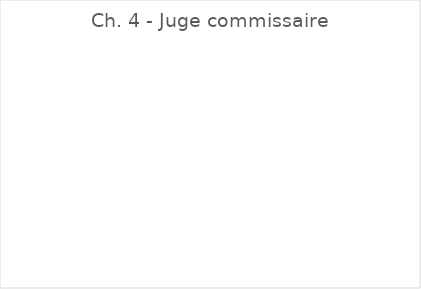
| Category | Ch. 4 - Juge commissaire |
|---|---|
| A. DAMERON | 0 |
| N. de SCHONEN | 0 |
| G. PLOCQ | 0 |
| J.-F. JAVIER | 0 |
| J. PARADIS | 0 |
| F. JACQUIER | 0 |
| Ph. BONDUELLE | 0 |
| P. DELABARRE | 0 |
| A. SCHEID | 0 |
| O. TASSAN | 0 |
| Ch. COTELLE | 0 |
| M. DAVID | 0 |
| D. DAEVIDIAK | 0 |